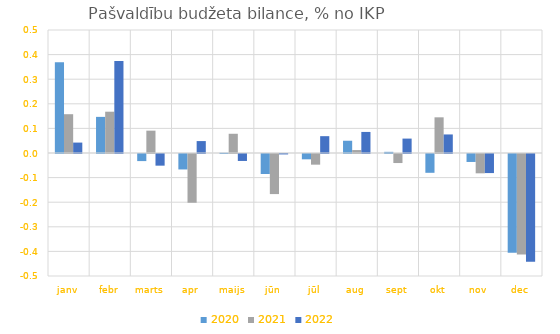
| Category | 2020 | 2021 | 2022 |
|---|---|---|---|
| janv | 0.369 | 0.158 | 0.042 |
| febr | 0.147 | 0.168 | 0.374 |
| marts | -0.029 | 0.091 | -0.047 |
| apr | -0.063 | -0.198 | 0.048 |
| maijs | 0.001 | 0.078 | -0.028 |
| jūn | -0.081 | -0.163 | -0.002 |
| jūl | -0.022 | -0.043 | 0.068 |
| aug | 0.05 | 0.012 | 0.086 |
| sept | 0.005 | -0.037 | 0.059 |
| okt | -0.076 | 0.145 | 0.075 |
| nov | -0.032 | -0.079 | -0.078 |
| dec | -0.401 | -0.409 | -0.439 |